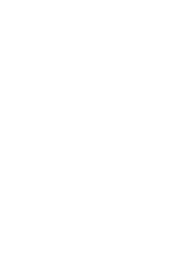
| Category | Series 0 |
|---|---|
| Collegiality | 0 |
| Team working | 0 |
| People management | 0 |
| Supervision | 0 |
| Mentoring | 0 |
| Influence and leadership | 0 |
| Collaboration | 0 |
| Equality and diversity | 0 |